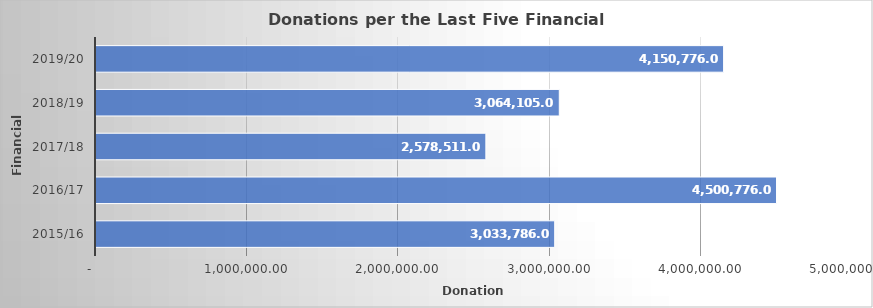
| Category | GRAND TOTAL |
|---|---|
| 2015/16 | 3033786 |
| 2016/17 | 4500776 |
| 2017/18 | 2578511 |
| 2018/19 | 3064105 |
| 2019/20 | 4150776 |